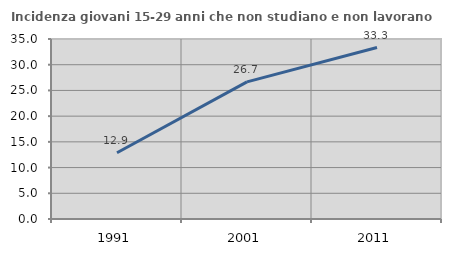
| Category | Incidenza giovani 15-29 anni che non studiano e non lavorano  |
|---|---|
| 1991.0 | 12.888 |
| 2001.0 | 26.667 |
| 2011.0 | 33.333 |